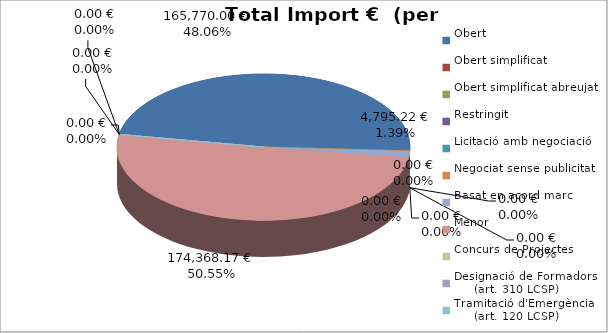
| Category | Total preu
(amb IVA) |
|---|---|
| Obert | 165770 |
| Obert simplificat | 0 |
| Obert simplificat abreujat | 0 |
| Restringit | 0 |
| Licitació amb negociació | 0 |
| Negociat sense publicitat | 0 |
| Basat en acord marc | 4795.22 |
| Menor | 174368.17 |
| Concurs de Projectes | 0 |
| Designació de Formadors
     (art. 310 LCSP) | 0 |
| Tramitació d'Emergència
     (art. 120 LCSP) | 0 |